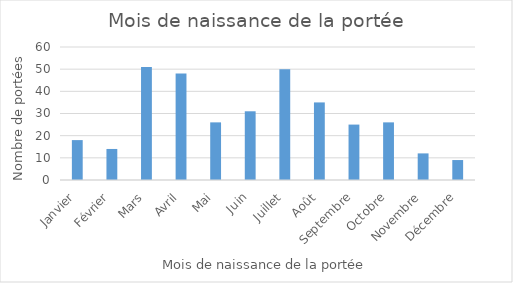
| Category | Series 0 |
|---|---|
| Janvier | 18 |
| Février | 14 |
| Mars | 51 |
| Avril | 48 |
| Mai | 26 |
| Juin | 31 |
| Juillet | 50 |
| Août | 35 |
| Septembre | 25 |
| Octobre | 26 |
| Novembre | 12 |
| Décembre | 9 |